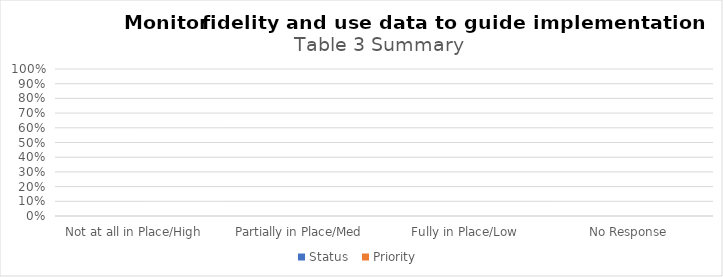
| Category | Status  | Priority  |
|---|---|---|
| Not at all in Place/High  | 0 | 0 |
| Partially in Place/Med | 0 | 0 |
| Fully in Place/Low | 0 | 0 |
| No Response | 0 | 0 |